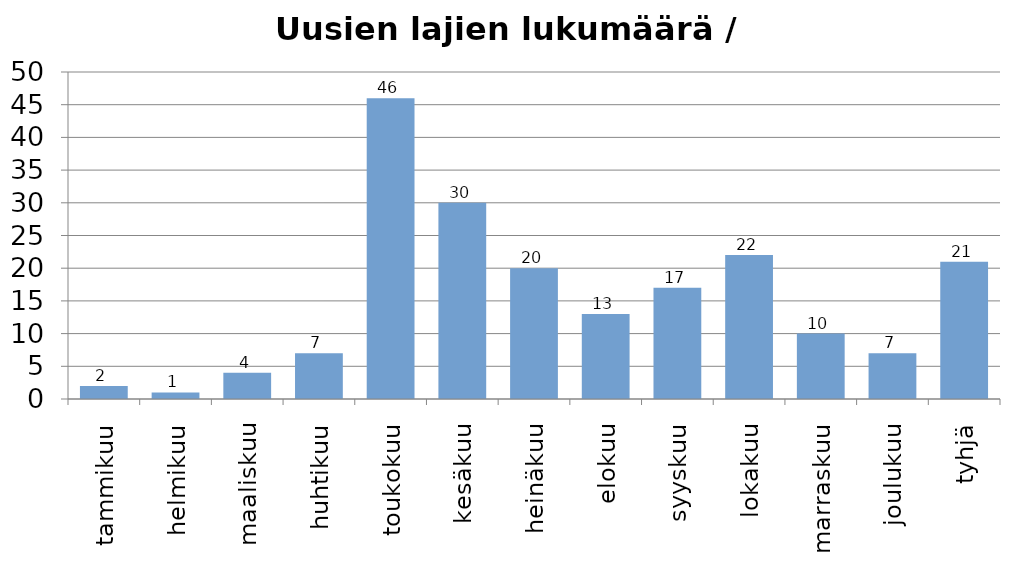
| Category | Yhteensä |
|---|---|
| tammikuu | 2 |
| helmikuu | 1 |
| maaliskuu | 4 |
| huhtikuu | 7 |
| toukokuu | 46 |
| kesäkuu | 30 |
| heinäkuu | 20 |
| elokuu | 13 |
| syyskuu | 17 |
| lokakuu | 22 |
| marraskuu | 10 |
| joulukuu | 7 |
| tyhjä | 21 |